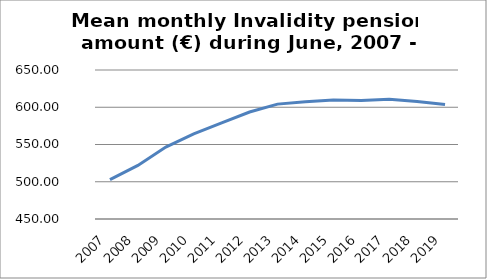
| Category | Series 0 |
|---|---|
| 2007.0 | 502.814 |
| 2008.0 | 521.879 |
| 2009.0 | 546.531 |
| 2010.0 | 564.26 |
| 2011.0 | 578.914 |
| 2012.0 | 593.581 |
| 2013.0 | 604.194 |
| 2014.0 | 607.259 |
| 2015.0 | 609.599 |
| 2016.0 | 609.16 |
| 2017.0 | 610.67 |
| 2018.0 | 607.87 |
| 2019.0 | 603.63 |